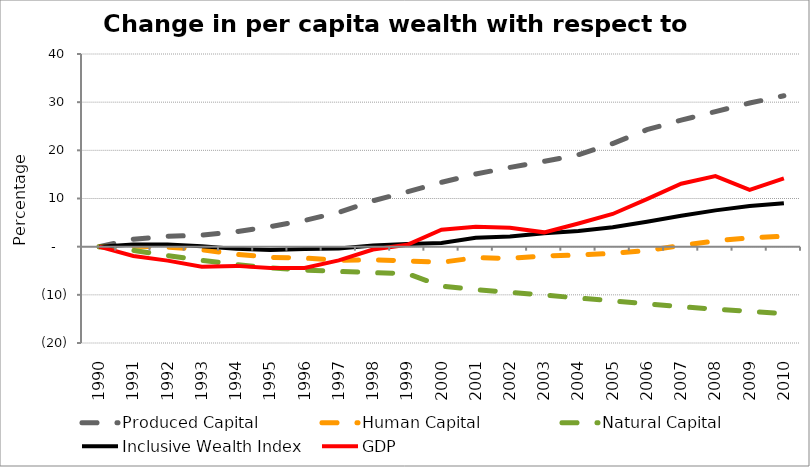
| Category | Produced Capital  | Human Capital | Natural Capital | Inclusive Wealth Index | GDP |
|---|---|---|---|---|---|
| 1990.0 | 0 | 0 | 0 | 0 | 0 |
| 1991.0 | 1.549 | 0.092 | -0.774 | 0.434 | -1.922 |
| 1992.0 | 2.136 | -0.079 | -1.85 | 0.43 | -2.898 |
| 1993.0 | 2.373 | -0.625 | -2.833 | 0.069 | -4.155 |
| 1994.0 | 3.104 | -1.568 | -3.703 | -0.458 | -3.988 |
| 1995.0 | 4.169 | -2.21 | -4.386 | -0.677 | -4.441 |
| 1996.0 | 5.437 | -2.372 | -4.853 | -0.491 | -4.416 |
| 1997.0 | 7.124 | -2.808 | -5.144 | -0.399 | -2.838 |
| 1998.0 | 9.523 | -2.72 | -5.386 | 0.255 | -0.59 |
| 1999.0 | 11.384 | -2.968 | -5.598 | 0.531 | 0.378 |
| 2000.0 | 13.352 | -3.249 | -8.161 | 0.756 | 3.522 |
| 2001.0 | 15.084 | -2.292 | -8.937 | 1.867 | 4.132 |
| 2002.0 | 16.457 | -2.437 | -9.465 | 2.09 | 3.916 |
| 2003.0 | 17.701 | -1.917 | -10.049 | 2.765 | 2.971 |
| 2004.0 | 19.089 | -1.727 | -10.668 | 3.233 | 4.802 |
| 2005.0 | 21.398 | -1.401 | -11.251 | 4.031 | 6.79 |
| 2006.0 | 24.281 | -0.79 | -11.892 | 5.177 | 9.876 |
| 2007.0 | 26.265 | 0.229 | -12.473 | 6.4 | 13.074 |
| 2008.0 | 28.048 | 1.199 | -12.978 | 7.538 | 14.657 |
| 2009.0 | 29.815 | 1.825 | -13.418 | 8.423 | 11.795 |
| 2010.0 | 31.327 | 2.164 | -13.916 | 9.035 | 14.183 |